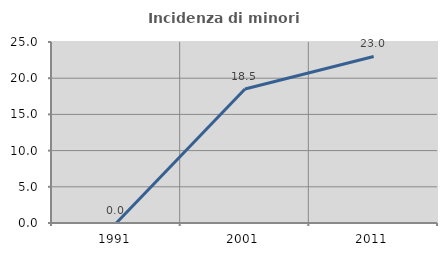
| Category | Incidenza di minori stranieri |
|---|---|
| 1991.0 | 0 |
| 2001.0 | 18.519 |
| 2011.0 | 23 |